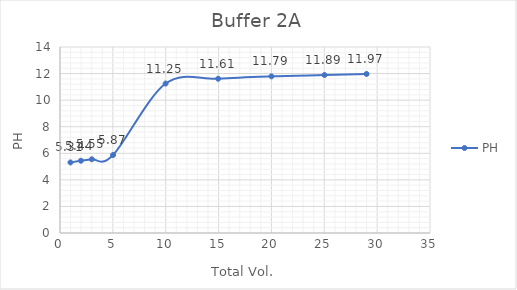
| Category | PH |
|---|---|
| 0.99 | 5.31 |
| 1.9799999999999998 | 5.44 |
| 3.01 | 5.55 |
| 5.02 | 5.87 |
| 9.989999999999998 | 11.25 |
| 14.959999999999999 | 11.61 |
| 20.0 | 11.79 |
| 25.02 | 11.89 |
| 29.0 | 11.97 |